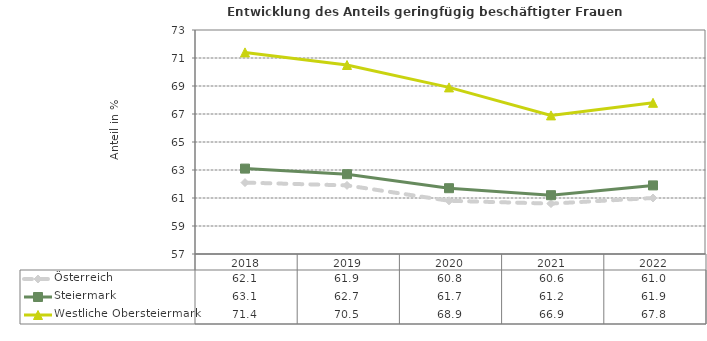
| Category | Österreich | Steiermark | Westliche Obersteiermark |
|---|---|---|---|
| 2022.0 | 61 | 61.9 | 67.8 |
| 2021.0 | 60.6 | 61.2 | 66.9 |
| 2020.0 | 60.8 | 61.7 | 68.9 |
| 2019.0 | 61.9 | 62.7 | 70.5 |
| 2018.0 | 62.1 | 63.1 | 71.4 |